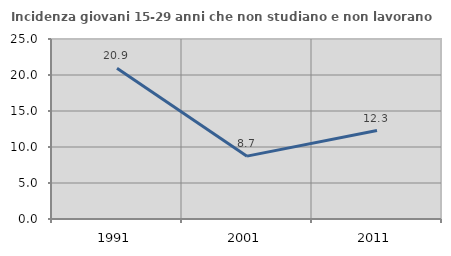
| Category | Incidenza giovani 15-29 anni che non studiano e non lavorano  |
|---|---|
| 1991.0 | 20.93 |
| 2001.0 | 8.73 |
| 2011.0 | 12.292 |